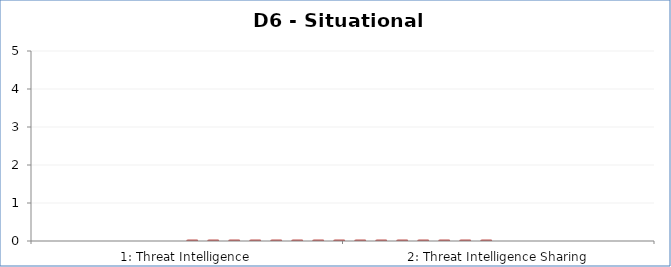
| Category | Assessment Factor Maturity |
|---|---|
| 1: Threat Intelligence | 0 |
| 2: Threat Intelligence Sharing | 0 |